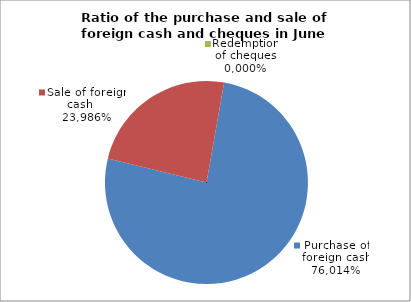
| Category | Purchase of foreign cash |
|---|---|
| 0 | 0.76 |
| 1 | 0.24 |
| 2 | 0 |